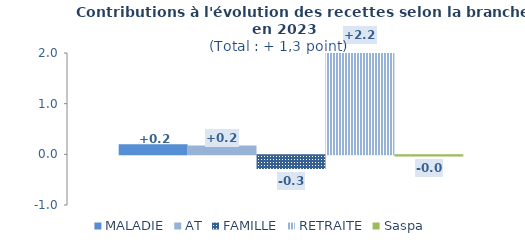
| Category | MALADIE | AT | FAMILLE | RETRAITE | Saspa |
|---|---|---|---|---|---|
| 0 | 0.197 | 0.172 | -0.268 | 2.196 | -0.023 |